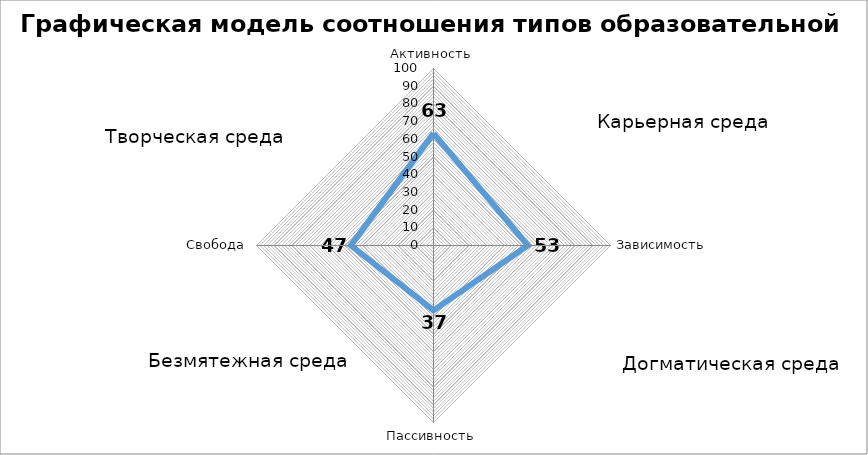
| Category | Графическая модель соотношения типов образовательной среды |
|---|---|
| Активность | 63.333 |
| Зависимость | 53.333 |
| Пассивность | 36.667 |
| Свобода | 46.667 |